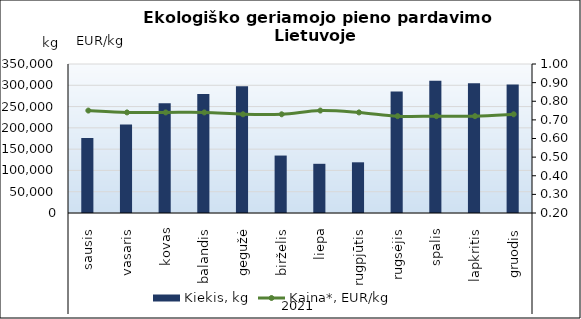
| Category | Kiekis, kg |
|---|---|
| 0 | 176468 |
| 1 | 207952 |
| 2 | 258024 |
| 3 | 279732 |
| 4 | 297989 |
| 5 | 134936 |
| 6 | 115569 |
| 7 | 119084 |
| 8 | 285260 |
| 9 | 310798 |
| 10 | 304629 |
| 11 | 302043 |